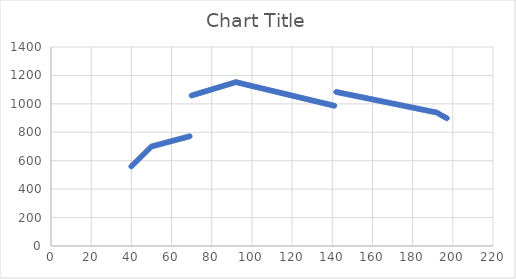
| Category | Series 0 |
|---|---|
| 40.0 | 560 |
| 41.0 | 574 |
| 42.0 | 588 |
| 43.0 | 602 |
| 44.0 | 616 |
| 45.0 | 630 |
| 46.0 | 644 |
| 47.0 | 658 |
| 48.0 | 672 |
| 49.0 | 686 |
| 50.0 | 700 |
| 51.0 | 703.778 |
| 52.0 | 707.556 |
| 53.0 | 711.333 |
| 54.0 | 715.111 |
| 55.0 | 718.889 |
| 56.0 | 722.667 |
| 57.0 | 726.444 |
| 58.0 | 730.222 |
| 59.0 | 734 |
| 60.0 | 737.778 |
| 61.0 | 741.556 |
| 62.0 | 745.333 |
| 63.0 | 749.111 |
| 64.0 | 752.889 |
| 65.0 | 756.667 |
| 66.0 | 760.444 |
| 67.0 | 764.222 |
| 68.0 | 768 |
| 69.0 | 771.778 |
| 128.0 | 1058.667 |
| 129.0 | 1062.944 |
| 130.0 | 1067.222 |
| 131.0 | 1071.5 |
| 132.0 | 1075.778 |
| 133.0 | 1080.056 |
| 134.0 | 1084.333 |
| 135.0 | 1088.611 |
| 136.0 | 1092.889 |
| 137.0 | 1097.167 |
| 138.0 | 1101.444 |
| 139.0 | 1105.722 |
| 140.0 | 1110 |
| 141.0 | 1114.278 |
| 142.0 | 1118.556 |
| 143.0 | 1122.833 |
| 144.0 | 1127.111 |
| 145.0 | 1131.389 |
| 146.0 | 1135.667 |
| 147.0 | 1139.944 |
| 148.0 | 1144.222 |
| 149.0 | 1148.5 |
| 150.0 | 1152.778 |
| 151.0 | 1149.389 |
| 152.0 | 1146 |
| 153.0 | 1142.611 |
| 154.0 | 1139.222 |
| 155.0 | 1135.833 |
| 156.0 | 1132.444 |
| 157.0 | 1129.056 |
| 158.0 | 1125.667 |
| 159.0 | 1122.278 |
| 160.0 | 1118.889 |
| 161.0 | 1115.5 |
| 162.0 | 1112.111 |
| 163.0 | 1108.722 |
| 164.0 | 1105.333 |
| 165.0 | 1101.944 |
| 166.0 | 1098.556 |
| 167.0 | 1095.167 |
| 168.0 | 1091.778 |
| 169.0 | 1088.389 |
| 170.0 | 1085 |
| 171.0 | 1081.611 |
| 172.0 | 1078.222 |
| 173.0 | 1074.833 |
| 174.0 | 1071.444 |
| 175.0 | 1068.056 |
| 176.0 | 1064.667 |
| 177.0 | 1061.278 |
| 178.0 | 1057.889 |
| 179.0 | 1054.5 |
| 180.0 | 1051.111 |
| 181.0 | 1047.722 |
| 182.0 | 1044.333 |
| 183.0 | 1040.944 |
| 184.0 | 1037.556 |
| 185.0 | 1034.167 |
| 186.0 | 1030.778 |
| 187.0 | 1027.389 |
| 188.0 | 1024 |
| 189.0 | 1020.611 |
| 190.0 | 1017.222 |
| 191.0 | 1013.833 |
| 192.0 | 1010.444 |
| 193.0 | 1007.056 |
| 194.0 | 1003.667 |
| 195.0 | 1000.278 |
| 196.0 | 996.889 |
| 197.0 | 993.5 |
| 198.0 | 990.111 |
| 199.0 | 986.722 |
| 200.0 | 1083.333 |
| 201.0 | 1080.444 |
| 202.0 | 1077.556 |
| 203.0 | 1074.667 |
| 204.0 | 1071.778 |
| 205.0 | 1068.889 |
| 206.0 | 1066 |
| 207.0 | 1063.111 |
| 208.0 | 1060.222 |
| 209.0 | 1057.333 |
| 210.0 | 1054.444 |
| 211.0 | 1051.556 |
| 212.0 | 1048.667 |
| 213.0 | 1045.778 |
| 214.0 | 1042.889 |
| 215.0 | 1040 |
| 216.0 | 1037.111 |
| 217.0 | 1034.222 |
| 218.0 | 1031.333 |
| 219.0 | 1028.444 |
| 220.0 | 1025.556 |
| 221.0 | 1022.667 |
| 222.0 | 1019.778 |
| 223.0 | 1016.889 |
| 224.0 | 1014 |
| 225.0 | 1011.111 |
| 226.0 | 1008.222 |
| 227.0 | 1005.333 |
| 228.0 | 1002.444 |
| 229.0 | 999.556 |
| 230.0 | 996.667 |
| 231.0 | 993.778 |
| 232.0 | 990.889 |
| 233.0 | 988 |
| 234.0 | 985.111 |
| 235.0 | 982.222 |
| 236.0 | 979.333 |
| 237.0 | 976.444 |
| 238.0 | 973.556 |
| 239.0 | 970.667 |
| 240.0 | 967.778 |
| 241.0 | 964.889 |
| 242.0 | 962 |
| 243.0 | 959.111 |
| 244.0 | 956.222 |
| 245.0 | 953.333 |
| 246.0 | 950.444 |
| 247.0 | 947.556 |
| 248.0 | 944.667 |
| 249.0 | 941.778 |
| 250.0 | 938.889 |
| 251.0 | 930.889 |
| 252.0 | 922.889 |
| 253.0 | 914.889 |
| 254.0 | 906.889 |
| 255.0 | 898.889 |